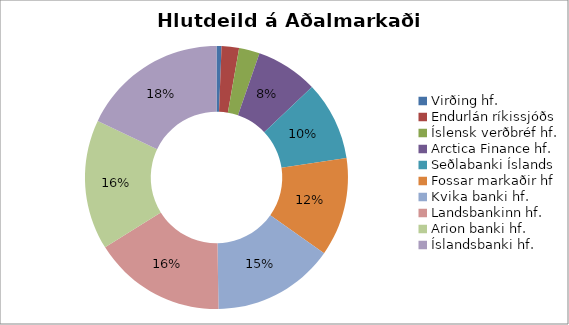
| Category | 2017 |
|---|---|
| Virðing hf. | 0.006 |
| Endurlán ríkissjóðs | 0.021 |
| Íslensk verðbréf hf. | 0.025 |
| Arctica Finance hf. | 0.076 |
| Seðlabanki Íslands | 0.097 |
| Fossar markaðir hf | 0.121 |
| Kvika banki hf. | 0.15 |
| Landsbankinn hf. | 0.163 |
| Arion banki hf. | 0.16 |
| Íslandsbanki hf. | 0.179 |